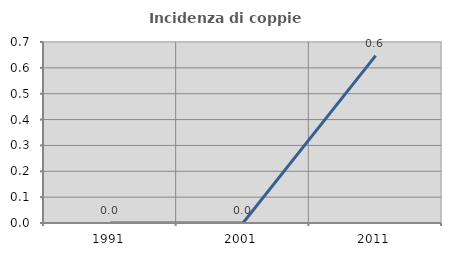
| Category | Incidenza di coppie miste |
|---|---|
| 1991.0 | 0 |
| 2001.0 | 0 |
| 2011.0 | 0.647 |